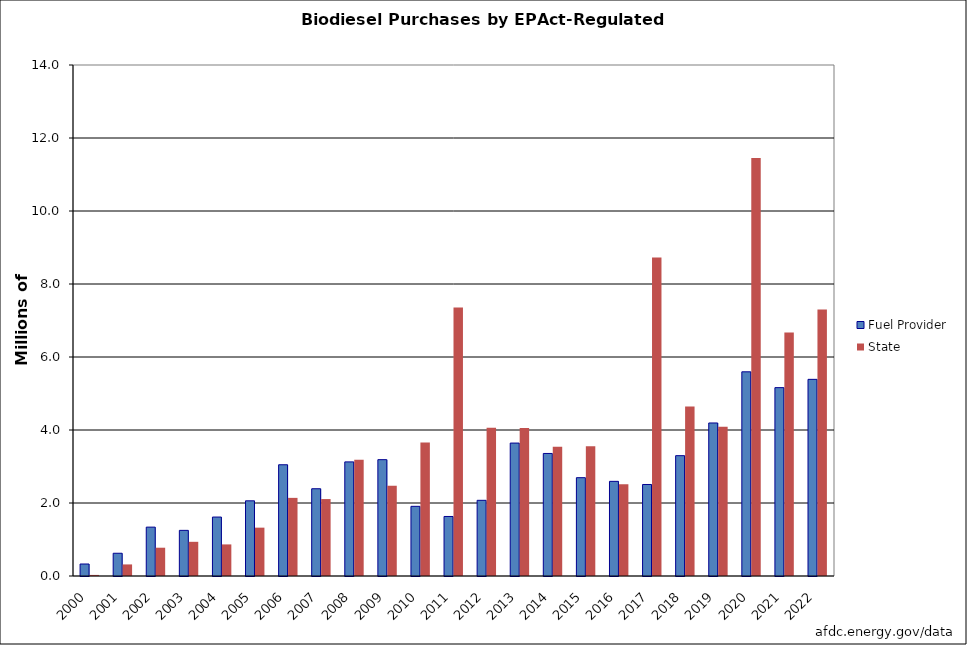
| Category | Fuel Provider | State |
|---|---|---|
| 2000.0 | 328700 | 29547 |
| 2001.0 | 622942 | 317250 |
| 2002.0 | 1338747 | 775041 |
| 2003.0 | 1250302 | 936616 |
| 2004.0 | 1615090 | 865485 |
| 2005.0 | 2059643 | 1324604 |
| 2006.0 | 3047855 | 2140564 |
| 2007.0 | 2390838 | 2107977 |
| 2008.0 | 3126348 | 3183212 |
| 2009.0 | 3187327 | 2471265 |
| 2010.0 | 1908758 | 3658164 |
| 2011.0 | 1630830 | 7354160 |
| 2012.0 | 2073597 | 4063314 |
| 2013.0 | 3641756 | 4057722 |
| 2014.0 | 3357118 | 3541764 |
| 2015.0 | 2693851 | 3551643 |
| 2016.0 | 2593058 | 2515122 |
| 2017.0 | 2506867 | 8727038 |
| 2018.0 | 3296781 | 4640663 |
| 2019.0 | 4192217 | 4090221 |
| 2020.0 | 5593923 | 11453926 |
| 2021.0 | 5160769 | 6671673 |
| 2022.0 | 5387642 | 7300646 |